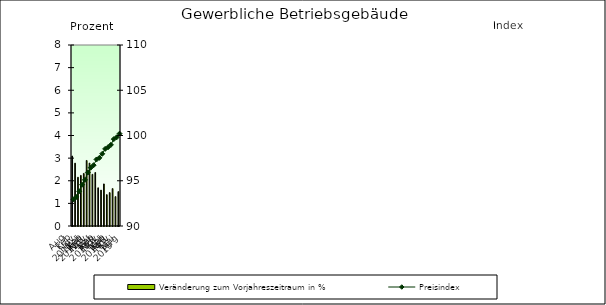
| Category | Veränderung zum Vorjahreszeitraum in % |
|---|---|
| 0 | 3.094 |
| 1 | 2.778 |
| 2 | 2.155 |
| 3 | 2.237 |
| 4 | 2.323 |
| 5 | 2.896 |
| 6 | 2.78 |
| 7 | 2.284 |
| 8 | 2.365 |
| 9 | 1.689 |
| 10 | 1.586 |
| 11 | 1.86 |
| 12 | 1.386 |
| 13 | 1.476 |
| 14 | 1.653 |
| 15 | 1.299 |
| 16 | 1.519 |